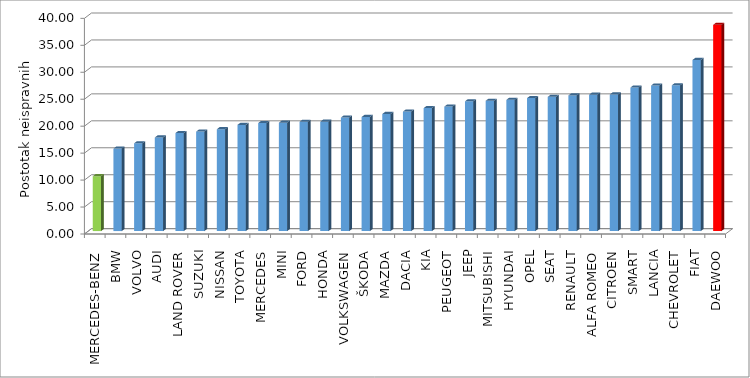
| Category | Series 4 |
|---|---|
| MERCEDES-BENZ | 10.167 |
| BMW | 15.294 |
| VOLVO | 16.276 |
| AUDI | 17.362 |
| LAND ROVER | 18.182 |
| SUZUKI | 18.456 |
| NISSAN | 18.889 |
| TOYOTA | 19.697 |
| MERCEDES | 20.033 |
| MINI | 20.098 |
| FORD | 20.274 |
| HONDA | 20.278 |
| VOLKSWAGEN | 21.057 |
| ŠKODA | 21.158 |
| MAZDA | 21.72 |
| DACIA | 22.168 |
| KIA | 22.807 |
| PEUGEOT | 23.093 |
| JEEP | 24.069 |
| MITSUBISHI | 24.168 |
| HYUNDAI | 24.341 |
| OPEL | 24.661 |
| SEAT | 24.894 |
| RENAULT | 25.156 |
| ALFA ROMEO | 25.287 |
| CITROEN | 25.329 |
| SMART | 26.625 |
| LANCIA | 26.998 |
| CHEVROLET | 27.035 |
| FIAT | 31.741 |
| DAEWOO | 38.251 |